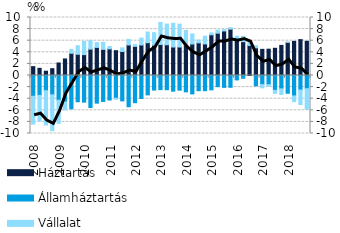
| Category | Háztartás | Államháztartás | Vállalat |
|---|---|---|---|
| 2008.0 | 1.526 | -3.58 | -4.805 |
| 2008.0 | 1.235 | -3.428 | -4.391 |
| 2008.0 | 0.739 | -2.626 | -5.902 |
| 2008.0 | 1.174 | -3.321 | -6.193 |
| 2009.0 | 2.16 | -4.26 | -3.987 |
| 2009.0 | 2.85 | -4.568 | -1.346 |
| 2009.0 | 3.828 | -5.737 | 0.678 |
| 2009.0 | 3.656 | -4.523 | 1.48 |
| 2010.0 | 3.601 | -4.596 | 2.265 |
| 2010.0 | 4.545 | -5.515 | 1.5 |
| 2010.0 | 4.841 | -4.769 | 0.833 |
| 2010.0 | 4.505 | -4.478 | 1.21 |
| 2011.0 | 4.594 | -4.232 | 0.415 |
| 2011.0 | 4.279 | -3.914 | -0.186 |
| 2011.0 | 4.137 | -4.378 | 0.626 |
| 2011.0 | 5.264 | -5.386 | 0.96 |
| 2012.0 | 5.02 | -4.694 | 0.302 |
| 2012.0 | 5.258 | -3.959 | 1.202 |
| 2012.0 | 5.654 | -3.339 | 1.84 |
| 2012.0 | 5.231 | -2.511 | 2.147 |
| 2013.0 | 5.34 | -2.438 | 3.812 |
| 2013.0 | 5.303 | -2.452 | 3.57 |
| 2013.0 | 4.913 | -2.704 | 4.093 |
| 2013.0 | 4.912 | -2.534 | 3.943 |
| 2014.0 | 5.3 | -2.818 | 2.455 |
| 2014.0 | 5.431 | -3.173 | 1.735 |
| 2014.0 | 5.628 | -2.624 | 0.485 |
| 2014.0 | 5.443 | -2.614 | 1.332 |
| 2015.0 | 7.012 | -2.474 | 0.329 |
| 2015.0 | 7.294 | -1.926 | 0.515 |
| 2015.0 | 7.68 | -2.046 | 0.227 |
| 2015.0 | 7.997 | -2.034 | 0.252 |
| 2016.0 | 6.134 | -0.755 | 0.63 |
| 2016.0 | 5.834 | -0.479 | 0.917 |
| 2016.0 | 5.168 | 0.034 | 0.628 |
| 2016.0 | 4.77 | -1.777 | 0.363 |
| 2017.0 | 4.507 | -1.562 | -0.571 |
| 2017.0 | 4.539 | -1.575 | -0.271 |
| 2017.0 | 4.691 | -2.563 | -0.518 |
| 2017.0 | 5.189 | -2.294 | -0.983 |
| 2018.0 | 5.709 | -3.063 | 0.039 |
| 2018.0 | 5.884 | -3.521 | -0.987 |
| 2018.0 | 6.187 | -2.501 | -2.511 |
| 2018.0 | 5.895 | -2.276 | -3.537 |